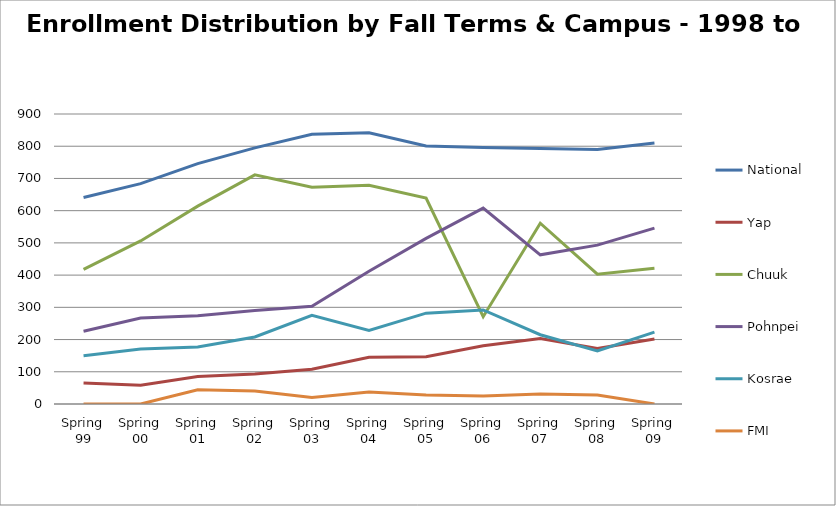
| Category | National | Yap | Chuuk | Pohnpei | Kosrae | FMI |
|---|---|---|---|---|---|---|
| Spring 99 | 641 | 65 | 418 | 226 | 150 | 0 |
| Spring 00 | 684 | 58 | 506 | 267 | 171 | 0 |
| Spring 01 | 746 | 85 | 614 | 274 | 177 | 44 |
| Spring 02 | 795 | 93 | 711 | 290 | 208 | 40 |
| Spring 03 | 837 | 108 | 673 | 303 | 275 | 20 |
| Spring 04 | 842 | 145 | 679 | 412 | 228 | 37 |
| Spring 05 | 801 | 147 | 639 | 514 | 282 | 28 |
| Spring 06 | 796 | 181 | 271 | 608 | 292 | 25 |
| Spring 07 | 793 | 203 | 561 | 463 | 215 | 31 |
| Spring 08 | 790 | 172 | 403 | 493 | 165 | 28 |
| Spring 09 | 810 | 202 | 421 | 546 | 223 | 0 |